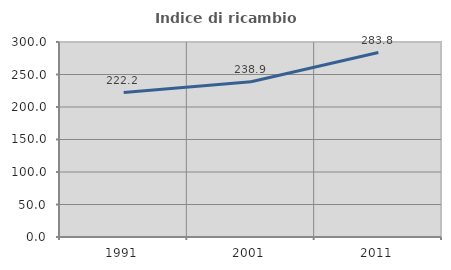
| Category | Indice di ricambio occupazionale  |
|---|---|
| 1991.0 | 222.222 |
| 2001.0 | 238.904 |
| 2011.0 | 283.754 |